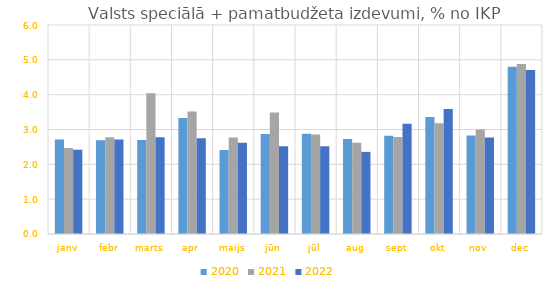
| Category | 2020 | 2021 | 2022 |
|---|---|---|---|
| janv | 2.713 | 2.472 | 2.42 |
| febr | 2.689 | 2.779 | 2.714 |
| marts | 2.701 | 4.044 | 2.779 |
| apr | 3.327 | 3.52 | 2.751 |
| maijs | 2.412 | 2.768 | 2.618 |
| jūn | 2.868 | 3.489 | 2.52 |
| jūl | 2.876 | 2.858 | 2.522 |
| aug | 2.731 | 2.619 | 2.358 |
| sept | 2.821 | 2.787 | 3.163 |
| okt | 3.357 | 3.182 | 3.589 |
| nov | 2.827 | 2.997 | 2.771 |
| dec | 4.801 | 4.883 | 4.709 |